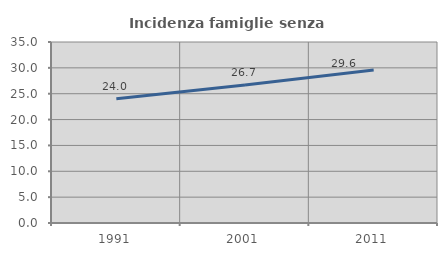
| Category | Incidenza famiglie senza nuclei |
|---|---|
| 1991.0 | 24.044 |
| 2001.0 | 26.667 |
| 2011.0 | 29.572 |